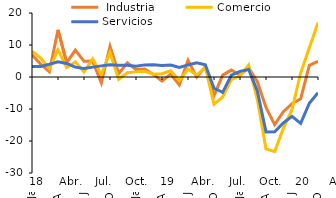
| Category |  Industria | Comercio | Servicios |
|---|---|---|---|
| 2018-01-01 | 6.938 | 8.064 | 3.285 |
| 2018-02-01 | 4.028 | 5.923 | 3.316 |
| 2018-03-01 | 1.633 | 2.511 | 3.973 |
| 2018-04-01 | 14.72 | 8.531 | 4.724 |
| 2018-05-01 | 4.476 | 2.979 | 4.23 |
| 2018-06-01 | 8.407 | 4.732 | 3.08 |
| 2018-07-01 | 4.901 | 1.551 | 2.664 |
| 2018-08-01 | 4.965 | 5.664 | 3.087 |
| 2018-09-01 | -1.793 | 0.728 | 3.473 |
| 2018-10-01 | 9.566 | 7.644 | 3.852 |
| 2018-11-01 | 1.071 | -0.693 | 3.696 |
| 2018-12-01 | 4.423 | 1.35 | 3.644 |
| 2019-01-01 | 2.354 | 1.603 | 3.356 |
| 2019-02-01 | 2.51 | 1.802 | 3.785 |
| 2019-03-01 | 0.809 | 0.885 | 3.797 |
| 2019-04-01 | -1.312 | 1.03 | 3.558 |
| 2019-05-01 | 0.922 | 1.946 | 3.73 |
| 2019-06-01 | -2.492 | -1.133 | 3.011 |
| 2019-07-01 | 5.205 | 2.479 | 3.772 |
| 2019-08-01 | -0.031 | 0.615 | 4.422 |
| 2019-09-01 | 3.223 | 3.044 | 3.824 |
| 2019-10-01 | -5.782 | -8.532 | -3.51 |
| 2019-11-01 | 0.601 | -6.23 | -4.783 |
| 2019-12-01 | 2.162 | -0.823 | 0.56 |
| 2020-01-01 | 0.555 | 0.304 | 1.766 |
| 2020-02-01 | 2.908 | 3.743 | 2.332 |
| 2020-03-01 | -1.46 | -7.066 | -4.367 |
| 2020-04-01 | -9.491 | -22.462 | -17.164 |
| 2020-05-01 | -14.865 | -23.32 | -17.092 |
| 2020-06-01 | -10.83 | -16.078 | -14.356 |
| 2020-07-01 | -8.312 | -10.205 | -12.312 |
| 2020-08-01 | -6.8 | 1.245 | -14.511 |
| 2020-09-01 | 3.65 | 9.118 | -8.2 |
| 2020-10-01 | 4.927 | 16.979 | -4.894 |